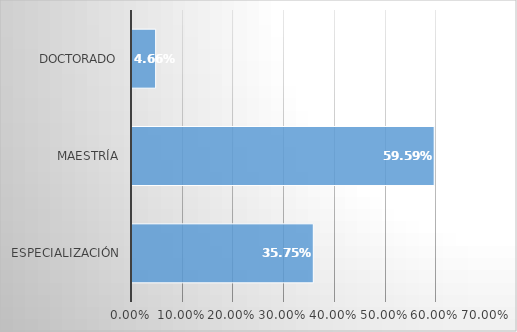
| Category | Series 0 |
|---|---|
| Especialización | 0.358 |
| Maestría | 0.596 |
| Doctorado | 0.047 |